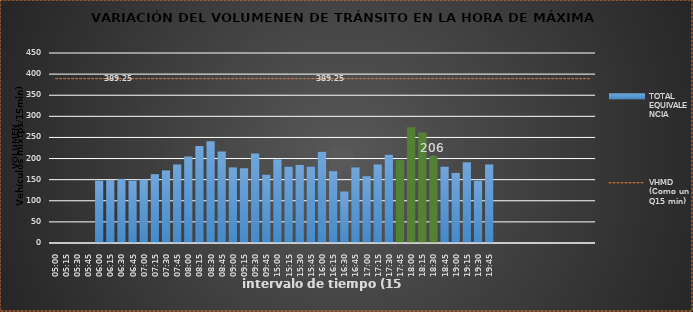
| Category | TOTAL EQUIVALENCIA   |
|---|---|
| 500.0 | 0 |
| 515.0 | 0 |
| 530.0 | 0 |
| 545.0 | 0 |
| 600.0 | 148 |
| 615.0 | 149 |
| 630.0 | 152 |
| 645.0 | 148 |
| 700.0 | 150 |
| 715.0 | 163 |
| 730.0 | 172 |
| 745.0 | 186 |
| 800.0 | 205 |
| 815.0 | 230 |
| 830.0 | 241 |
| 845.0 | 217 |
| 900.0 | 179 |
| 915.0 | 177 |
| 930.0 | 212 |
| 945.0 | 162 |
| 1500.0 | 198 |
| 1515.0 | 181 |
| 1530.0 | 185 |
| 1545.0 | 181 |
| 1600.0 | 216 |
| 1615.0 | 170 |
| 1630.0 | 122 |
| 1645.0 | 179 |
| 1700.0 | 158 |
| 1715.0 | 186 |
| 1730.0 | 209 |
| 1745.0 | 196 |
| 1800.0 | 274 |
| 1815.0 | 262 |
| 1830.0 | 206 |
| 1845.0 | 181 |
| 1900.0 | 166 |
| 1915.0 | 191 |
| 1930.0 | 148 |
| 1945.0 | 186 |